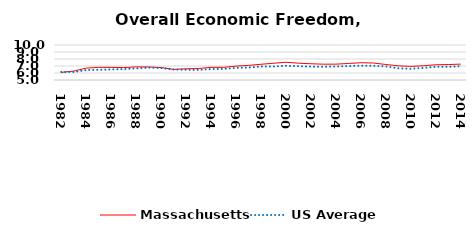
| Category | Massachusetts | US Average |
|---|---|---|
| 1982.0 | 6.085 | 6.149 |
| 1983.0 | 6.279 | 6.152 |
| 1984.0 | 6.697 | 6.429 |
| 1985.0 | 6.809 | 6.464 |
| 1986.0 | 6.803 | 6.512 |
| 1987.0 | 6.774 | 6.552 |
| 1988.0 | 6.876 | 6.659 |
| 1989.0 | 6.859 | 6.767 |
| 1990.0 | 6.781 | 6.71 |
| 1991.0 | 6.515 | 6.502 |
| 1992.0 | 6.601 | 6.463 |
| 1993.0 | 6.642 | 6.446 |
| 1994.0 | 6.806 | 6.563 |
| 1995.0 | 6.806 | 6.593 |
| 1996.0 | 6.985 | 6.73 |
| 1997.0 | 7.085 | 6.781 |
| 1998.0 | 7.246 | 6.926 |
| 1999.0 | 7.391 | 6.925 |
| 2000.0 | 7.535 | 7.031 |
| 2001.0 | 7.4 | 6.969 |
| 2002.0 | 7.321 | 6.912 |
| 2003.0 | 7.258 | 6.892 |
| 2004.0 | 7.265 | 6.934 |
| 2005.0 | 7.36 | 6.99 |
| 2006.0 | 7.465 | 7.048 |
| 2007.0 | 7.428 | 7.028 |
| 2008.0 | 7.214 | 6.935 |
| 2009.0 | 7.023 | 6.668 |
| 2010.0 | 6.94 | 6.605 |
| 2011.0 | 7.038 | 6.72 |
| 2012.0 | 7.176 | 6.883 |
| 2013.0 | 7.207 | 6.881 |
| 2014.0 | 7.27 | 6.973 |